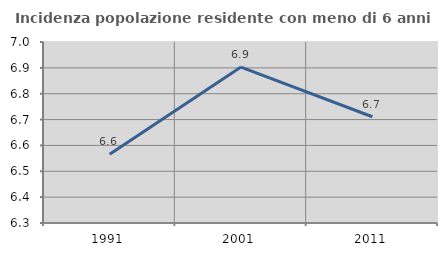
| Category | Incidenza popolazione residente con meno di 6 anni |
|---|---|
| 1991.0 | 6.566 |
| 2001.0 | 6.903 |
| 2011.0 | 6.711 |